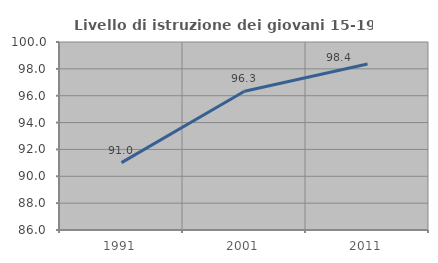
| Category | Livello di istruzione dei giovani 15-19 anni |
|---|---|
| 1991.0 | 91.017 |
| 2001.0 | 96.336 |
| 2011.0 | 98.357 |